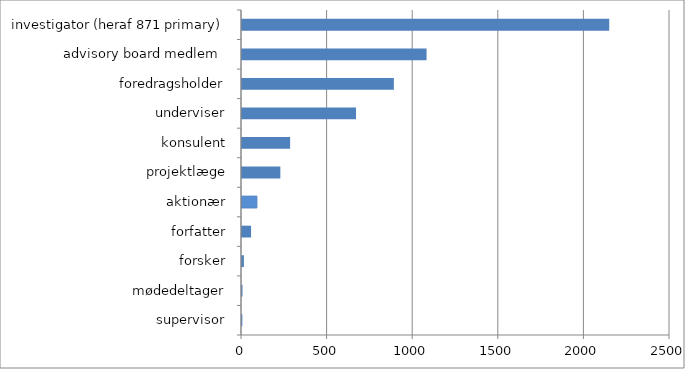
| Category | Series 0 |
|---|---|
| supervisor | 2 |
| mødedeltager | 3 |
| forsker | 11 |
| forfatter | 53 |
| aktionær | 87 |
| projektlæge | 224 |
| konsulent | 281 |
| underviser | 666 |
| foredragsholder | 887 |
| advisory board medlem  | 1078 |
| investigator (heraf 871 primary) | 2145 |